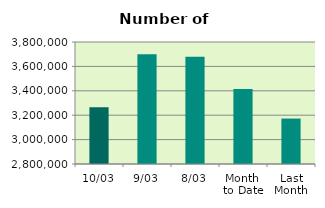
| Category | Series 0 |
|---|---|
| 10/03 | 3264146 |
| 9/03 | 3698682 |
| 8/03 | 3679680 |
| Month 
to Date | 3414207 |
| Last
Month | 3172414.4 |